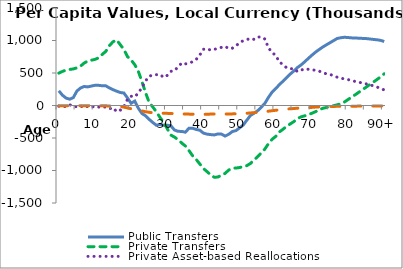
| Category | Public Transfers | Private Transfers | Private Asset-based Reallocations | Public Asset-based Reallocations |
|---|---|---|---|---|
| 0 | 225477.12 | 498271.26 | -11394.585 | -2131.715 |
|  | 159250.71 | 524114.28 | -14827.843 | -2243.337 |
| 2 | 114890.67 | 545400.14 | -16493.78 | -2312.07 |
| 3 | 96881.449 | 554450.33 | 13204.009 | -2330.559 |
| 4 | 121039.05 | 562540.54 | -18246.841 | -2341.599 |
| 5 | 221744.94 | 578968.02 | -18395.392 | -2409.438 |
| 6 | 269107.24 | 605388.87 | -4794.638 | -2510.002 |
| 7 | 292629.42 | 652623.47 | -33828.862 | -2671.988 |
| 8 | 286414.13 | 684016.83 | -11495.263 | -2738.307 |
| 9 | 298843.84 | 696696.01 | -7717.769 | -2728.381 |
| 10 | 310835.35 | 709538.61 | -31767.67 | -2769.15 |
| 11 | 310144.62 | 732105.67 | -24402.013 | -2876.087 |
| 12 | 303615.97 | 785016.037 | -20312.557 | -4462.043 |
| 13 | 302968.46 | 832677.124 | -25763.642 | -5398.558 |
| 14 | 269954.13 | 921700.923 | -50801.626 | -6547.474 |
| 15 | 243231.4 | 980657.282 | -34397.255 | -8209.845 |
| 16 | 220110.95 | 1008755.873 | -93610.534 | -10899.166 |
| 17 | 200238.79 | 935740.778 | -72405.174 | -15383.326 |
| 18 | 191878.28 | 862469.885 | -18086.25 | -25238.65 |
| 19 | 115539.85 | 751630.85 | 95556.162 | -37635.862 |
| 20 | 33650.308 | 700747.275 | 142550.86 | -49786.81 |
| 21 | 67875.232 | 628145.344 | 134343.48 | -60051.22 |
| 22 | -41655.162 | 524434.188 | 190833.341 | -71165.921 |
| 23 | -123359.06 | 368638.222 | 277857.441 | -84487.141 |
| 24 | -158858.48 | 196650.407 | 377405.478 | -95733.746 |
| 25 | -213585.15 | 46356.51 | 451236.517 | -104827.757 |
| 26 | -261643.05 | -22263.514 | 467380.017 | -111813.63 |
| 27 | -304502.53 | -99073.565 | 474044.546 | -115477.213 |
| 28 | -290987.02 | -183763.087 | 476500.714 | -117290.404 |
| 29 | -303630.87 | -259380.303 | 431789.57 | -119611.7 |
| 30 | -303284.62 | -357322.463 | 463343.642 | -121069.262 |
| 31 | -311840.94 | -455503.276 | 526197.275 | -122695.665 |
| 32 | -377712.57 | -486269.597 | 536128.313 | -125235.783 |
| 33 | -397414.41 | -526095.123 | 595187.475 | -127982.935 |
| 34 | -398845.83 | -577659.381 | 653741.171 | -130037.431 |
| 35 | -411078.13 | -622751.964 | 639560.853 | -131379.183 |
| 36 | -350344.52 | -693337.678 | 652820.547 | -132673.007 |
| 37 | -349956.1 | -772360.455 | 672533.135 | -133678.475 |
| 38 | -368670.65 | -829543.758 | 708655.173 | -134489.783 |
| 39 | -380514.34 | -900123.208 | 776555.784 | -135208.274 |
| 40 | -424390.29 | -969183.804 | 864839.519 | -136712.339 |
| 41 | -440511.64 | -1017329.75 | 872765.984 | -134878.644 |
| 42 | -447619.98 | -1066642.595 | 852410.251 | -131952.071 |
| 43 | -453010.96 | -1103775.11 | 863060.312 | -131333.032 |
| 44 | -437161.99 | -1100782.438 | 880979.698 | -130598.278 |
| 45 | -440292.42 | -1072410.202 | 894203.084 | -130118.534 |
| 46 | -470418.88 | -1043869.746 | 908806.381 | -131227.411 |
| 47 | -442405.17 | -992931.839 | 875986.862 | -129975.622 |
| 48 | -400618.65 | -965374.108 | 881645.423 | -128958.403 |
| 49 | -386150.18 | -962116.969 | 918711.799 | -127576.859 |
| 50 | -344233.2 | -954372.741 | 964644.381 | -126217.861 |
| 51 | -300824.73 | -940901.707 | 997000.166 | -123937.176 |
| 52 | -226433.2 | -925112.66 | 1013547.501 | -119619.141 |
| 53 | -153636.28 | -891822.963 | 1032812.446 | -114591.526 |
| 54 | -118887.26 | -837508.418 | 1017170.549 | -109596.462 |
| 55 | -80273.678 | -787738.77 | 1052775.678 | -105725.732 |
| 56 | -26161.228 | -728284.172 | 1054675.438 | -101413.898 |
| 57 | 33453.117 | -669642.652 | 1022579.125 | -96299.615 |
| 58 | 125979.81 | -585001.731 | 886989.509 | -87477.659 |
| 59 | 206279.01 | -519889.012 | 814655.647 | -80062.867 |
| 60 | 261702.37 | -475646.589 | 770483.344 | -73438.634 |
| 61 | 319464.9 | -407271.976 | 670910.258 | -66239.124 |
| 62 | 373846.18 | -366020.155 | 628464.475 | -59936.394 |
| 63 | 428165.05 | -319935.58 | 580651.944 | -54645.844 |
| 64 | 483058.31 | -284027.33 | 565377.612 | -50642.102 |
| 65 | 530197.55 | -247357.43 | 565975.826 | -46778.796 |
| 66 | 583577.02 | -202800.93 | 521267.597 | -41320.067 |
| 67 | 623556.55 | -174764.92 | 543508.924 | -38825.474 |
| 68 | 671504.04 | -159150.65 | 563734.873 | -36432.813 |
| 69 | 723855.39 | -139425.33 | 557194.323 | -33016.423 |
| 70 | 773396.08 | -119584.64 | 554450.945 | -29009.045 |
| 71 | 820239.65 | -95131.44 | 538013.23 | -24391.59 |
| 72 | 860845.4 | -69815.64 | 530333.146 | -21459.006 |
| 73 | 899246.83 | -42914.25 | 502337.7 | -18396.55 |
| 74 | 933234.03 | -30599.3 | 488377.4 | -16536.4 |
| 75 | 965279.39 | -15842.95 | 477221.362 | -15309.122 |
| 76 | 998235.52 | -3853.83 | 459960.881 | -14134.261 |
| 77 | 1030896.9 | 10286.835 | 435218.024 | -12985.224 |
| 78 | 1042447 | 27902.971 | 421461.463 | -12280.563 |
| 79 | 1049759.6 | 53984.374 | 407400.21 | -11568.51 |
| 80 | 1045588.8 | 91318.872 | 398499.254 | -11031.854 |
| 81 | 1040412.9 | 128980.172 | 383929.484 | -10498.084 |
| 82 | 1038566.5 | 166048.555 | 369438.354 | -9916.454 |
| 83 | 1035336.1 | 204534.787 | 357211.58 | -9376.38 |
| 84 | 1032226 | 243624.141 | 345219.603 | -8846.003 |
| 85 | 1029630.8 | 281920.195 | 333200.194 | -8318.594 |
| 86 | 1023620.6 | 321358.764 | 322777.194 | -7901.794 |
| 87 | 1016701.2 | 359586.286 | 300299.095 | -7501.195 |
| 88 | 1010999 | 399457.018 | 284374.099 | -7068.299 |
| 89 | 1002050.1 | 440075.361 | 259810.92 | -6769.42 |
| 90+ | 984370.68 | 487809.48 | 239979.93 | -6633.33 |